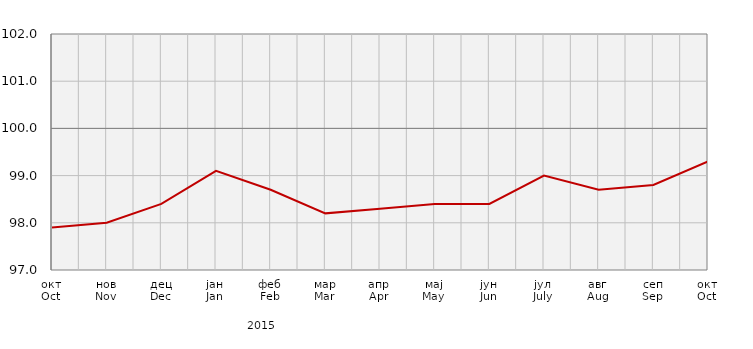
| Category | Индекси потрошачких цијена
Consumer price indices |
|---|---|
| окт
Oct | 97.9 |
| нов
Nov | 98 |
| дец
Dec | 98.4 |
| јан
Jan | 99.1 |
| феб
Feb | 98.7 |
| мар
Mar | 98.2 |
| апр
Apr | 98.3 |
| мај
May | 98.4 |
| јун
Jun | 98.4 |
| јул
July | 99 |
| авг
Aug | 98.7 |
| сеп
Sep | 98.8 |
| окт
Oct | 99.3 |